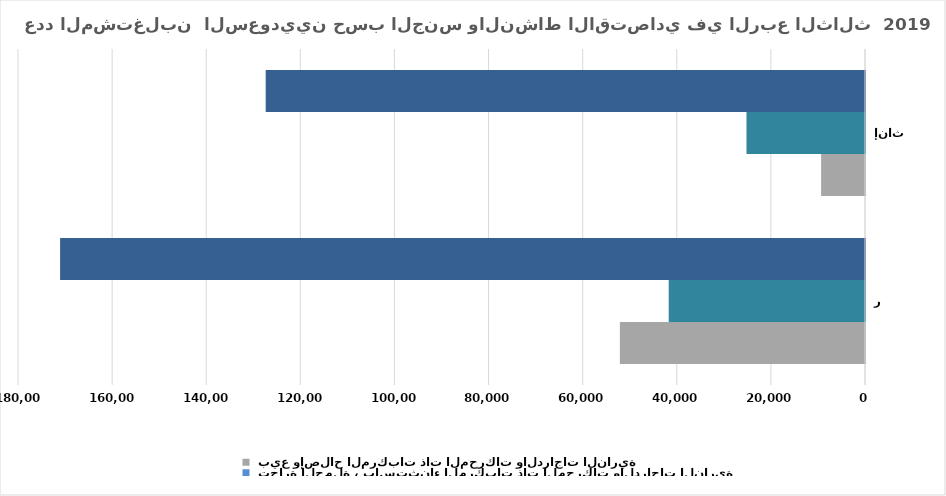
| Category |  بيع وإصلاح المركبات ذات المحركات والدراجات النارية |  تجارة الجملة ، باستثناء المركبات ذات المحركات والدراجات النارية |  تجارة التجزئة، باستثناء المركبات ذات المحركات والدراجات النارية |
|---|---|---|---|
| ذكور | 52093 | 41709 | 171053 |
| إناث | 9324 | 25187 | 127361 |